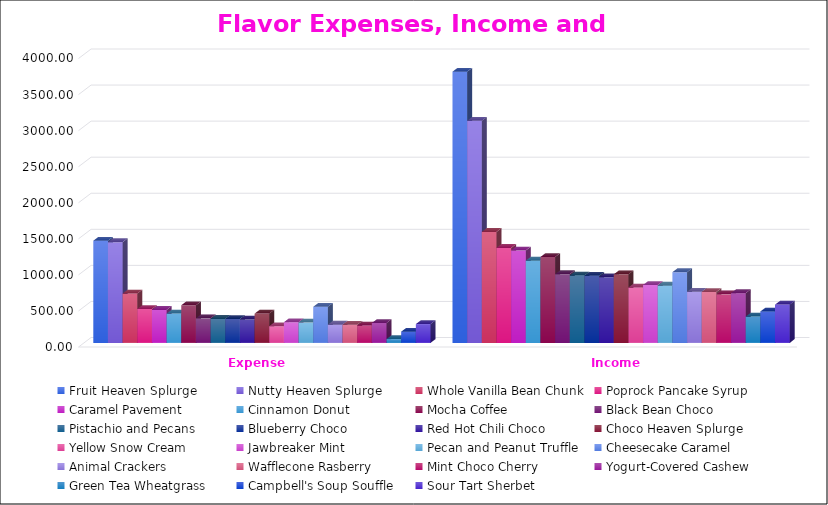
| Category | Fruit Heaven Splurge | Nutty Heaven Splurge | Whole Vanilla Bean Chunk | Poprock Pancake Syrup | Caramel Pavement | Cinnamon Donut | Mocha Coffee | Black Bean Choco | Pistachio and Pecans | Blueberry Choco | Red Hot Chili Choco | Choco Heaven Splurge | Yellow Snow Cream | Jawbreaker Mint | Pecan and Peanut Truffle | Cheesecake Caramel | Animal Crackers | Wafflecone Rasberry | Mint Choco Cherry | Yogurt-Covered Cashew | Green Tea Wheatgrass | Campbell's Soup Souffle | Sour Tart Sherbet |
|---|---|---|---|---|---|---|---|---|---|---|---|---|---|---|---|---|---|---|---|---|---|---|---|
| Expense | 1416.68 | 1397.12 | 683.76 | 469.92 | 457.6 | 406.56 | 522.24 | 340.18 | 332.8 | 331.76 | 325 | 405.84 | 231.7 | 287 | 283.14 | 500.5 | 253.11 | 251.64 | 240.3 | 275.66 | 52.92 | 155.4 | 261 |
| Income | 3760.16 | 3078.4 | 1539.12 | 1317.36 | 1281.8 | 1140.48 | 1191.36 | 952.97 | 933.4 | 929.5 | 910 | 950.52 | 767.92 | 803.6 | 793.65 | 980.98 | 709.28 | 705.99 | 672.84 | 689.92 | 364.77 | 435.4 | 530.7 |